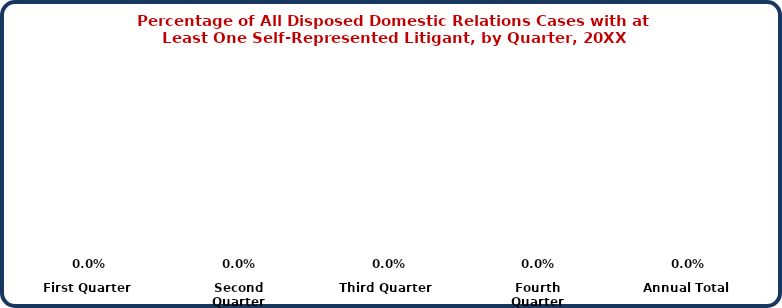
| Category | Domestic Relations |
|---|---|
| First Quarter | 0 |
| Second Quarter | 0 |
| Third Quarter | 0 |
| Fourth Quarter | 0 |
| Annual Total | 0 |